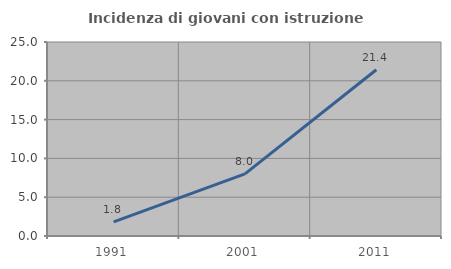
| Category | Incidenza di giovani con istruzione universitaria |
|---|---|
| 1991.0 | 1.818 |
| 2001.0 | 8 |
| 2011.0 | 21.429 |